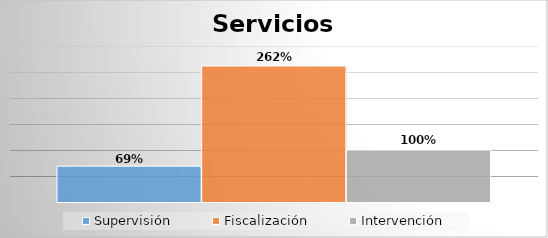
| Category | Supervisión | Fiscalización | Intervención |
|---|---|---|---|
| 0 | 0.689 | 2.615 | 1 |